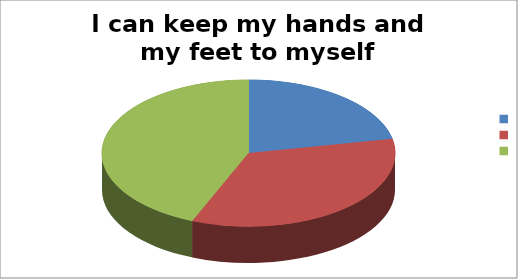
| Category | I can keep my hands and my feet to myself |
|---|---|
|  | 7 |
|  | 11 |
|  | 14 |